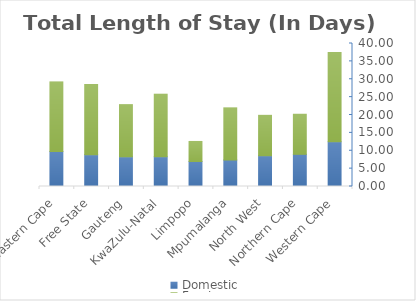
| Category | Domestic | Foreign |
|---|---|---|
| Eastern Cape | 9.8 | 19.4 |
| Free State | 8.9 | 19.6 |
| Gauteng | 8.3 | 14.6 |
| KwaZulu-Natal | 8.3 | 17.5 |
| Limpopo | 7 | 5.6 |
| Mpumalanga | 7.4 | 14.6 |
| North West | 8.6 | 11.3 |
| Northern Cape | 9 | 11.2 |
| Western Cape | 12.5 | 25 |